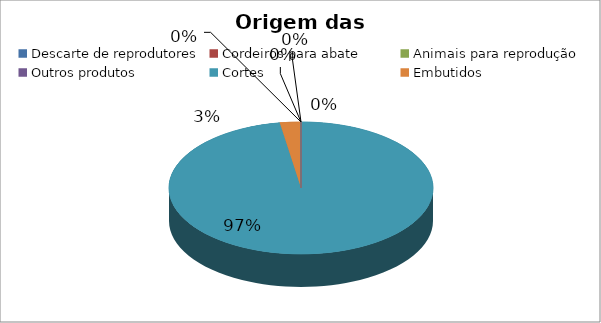
| Category | Series 0 |
|---|---|
| Descarte de reprodutores | 0 |
| Cordeiros para abate | 0 |
| Animais para reprodução | 0 |
| Outros produtos | 0 |
| Cortes | 0.974 |
| Embutidos | 0.026 |